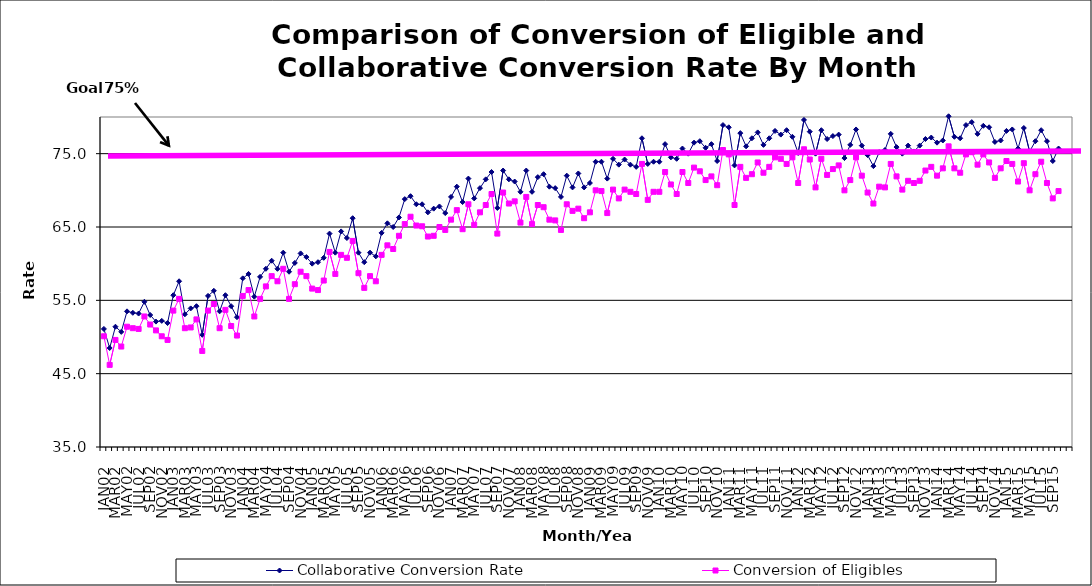
| Category | Collaborative Conversion Rate | Conversion of Eligibles |
|---|---|---|
| JAN02 | 51.1 | 50.1 |
| FEB02 | 48.5 | 46.2 |
| MAR02 | 51.4 | 49.6 |
| APR02 | 50.7 | 48.7 |
| MAY02 | 53.5 | 51.4 |
| JUN02 | 53.3 | 51.2 |
| JUL02 | 53.2 | 51.1 |
| AUG02 | 54.8 | 52.8 |
| SEP02 | 53 | 51.7 |
| OCT02 | 52.1 | 50.9 |
| NOV02 | 52.2 | 50.1 |
| DEC02 | 51.9 | 49.6 |
| JAN03 | 55.7 | 53.6 |
| FEB03 | 57.6 | 55.2 |
| MAR03 | 53.1 | 51.2 |
| APR03 | 53.9 | 51.3 |
| MAY03 | 54.2 | 52.4 |
| JUN03 | 50.3 | 48.1 |
| JUL03 | 55.6 | 53.6 |
| AUG03 | 56.3 | 54.5 |
| SEP03 | 53.5 | 51.2 |
| OCT03 | 55.7 | 53.7 |
| NOV03 | 54.2 | 51.5 |
| DEC03 | 52.7 | 50.2 |
| JAN04 | 58 | 55.6 |
| FEB04 | 58.6 | 56.4 |
| MAR04 | 55.5 | 52.8 |
| APR04 | 58.2 | 55.2 |
| MAY04 | 59.3 | 56.9 |
| JUN04 | 60.4 | 58.3 |
| JUL04 | 59.3 | 57.6 |
| AUG04 | 61.5 | 59.3 |
| SEP04 | 58.9 | 55.2 |
| OCT04 | 60.1 | 57.2 |
| NOV04 | 61.4 | 58.9 |
| DEC04 | 60.9 | 58.3 |
| JAN05 | 60 | 56.6 |
| FEB05 | 60.2 | 56.4 |
| MAR05 | 60.8 | 57.7 |
| APR05 | 64.1 | 61.6 |
| MAY05 | 61.5 | 58.6 |
| JUN05 | 64.4 | 61.2 |
| JUL05 | 63.5 | 60.8 |
| AUG05 | 66.2 | 63.1 |
| SEP05 | 61.5 | 58.7 |
| OCT05 | 60.2 | 56.7 |
| NOV05 | 61.5 | 58.3 |
| DEC05 | 61 | 57.6 |
| JAN06 | 64.2 | 61.2 |
| FEB06 | 65.5 | 62.5 |
| MAR06 | 65 | 62 |
| APR06 | 66.3 | 63.8 |
| MAY06 | 68.8 | 65.4 |
| JUN06 | 69.2 | 66.4 |
| JUL06 | 68.1 | 65.2 |
| AUG06 | 68.1 | 65.1 |
| SEP06 | 67 | 63.7 |
| OCT06 | 67.5 | 63.8 |
| NOV06 | 67.8 | 65 |
| DEC06 | 66.9 | 64.6 |
| JAN07 | 69.1 | 66 |
| FEB07 | 70.5 | 67.3 |
| MAR07 | 68.4 | 64.7 |
| APR07 | 71.6 | 68.1 |
| MAY07 | 68.9 | 65.3 |
| JUN07 | 70.3 | 67 |
| JUL07 | 71.5 | 68 |
| AUG07 | 72.5 | 69.5 |
| SEP07 | 67.6 | 64.1 |
| OCT07 | 72.7 | 69.7 |
| NOV07 | 71.5 | 68.2 |
| DEC07 | 71.2 | 68.5 |
| JAN08 | 69.8 | 65.6 |
| FEB08 | 72.7 | 69.1 |
| MAR08 | 69.8 | 65.4 |
| APR08 | 71.8 | 68 |
| MAY08 | 72.2 | 67.7 |
| JUN08 | 70.5 | 66 |
| JUL08 | 70.3 | 65.9 |
| AUG08 | 69.1 | 64.6 |
| SEP08 | 72 | 68.1 |
| OCT08 | 70.4 | 67.2 |
| NOV08 | 72.3 | 67.5 |
| DEC08 | 70.4 | 66.2 |
| JAN09 | 71 | 67 |
| FEB09 | 73.9 | 70 |
| MAR09 | 73.9 | 69.9 |
| APR09 | 71.6 | 66.9 |
| MAY09 | 74.3 | 70.1 |
| JUN09 | 73.5 | 68.9 |
| JUL09 | 74.2 | 70.1 |
| AUG09 | 73.5 | 69.8 |
| SEP09 | 73.2 | 69.5 |
| OCT09 | 77.1 | 73.6 |
| NOV09 | 73.6 | 68.7 |
| DEC09 | 73.9 | 69.8 |
| JAN10 | 73.9 | 69.8 |
| FEB10 | 76.3 | 72.5 |
| MAR10 | 74.5 | 70.8 |
| APR10 | 74.3 | 69.5 |
| MAY10 | 75.7 | 72.5 |
| JUN10 | 75 | 71 |
| JUL10 | 76.5 | 73.1 |
| AUG10 | 76.7 | 72.6 |
| SEP10 | 75.8 | 71.4 |
| OCT10 | 76.3 | 71.9 |
| NOV10 | 74 | 70.7 |
| DEC10 | 78.9 | 75.5 |
| JAN11 | 78.6 | 74.9 |
| FEB11 | 73.4 | 68 |
| MAR11 | 77.8 | 73.2 |
| APR11 | 76 | 71.7 |
| MAY11 | 77.1 | 72.2 |
| JUN11 | 77.9 | 73.8 |
| JUL11 | 76.2 | 72.4 |
| AUG11 | 77.1 | 73.2 |
| SEP11 | 78.1 | 74.5 |
| OCT11 | 77.6 | 74.3 |
| NOV11 | 78.2 | 73.6 |
| DEC11 | 77.3 | 74.5 |
| JAN12 | 75.1 | 71 |
| FEB12 | 79.6 | 75.6 |
| MAR12 | 78 | 74.2 |
| APR12 | 75 | 70.4 |
| MAY12 | 78.2 | 74.3 |
| JUN12 | 77 | 72.1 |
| JUL12 | 77.4 | 72.9 |
| AUG12 | 77.6 | 73.4 |
| SEP12 | 74.4 | 70 |
| OCT12 | 76.2 | 71.4 |
| NOV12 | 78.3 | 74.5 |
| DEC12 | 76.1 | 72 |
| JAN13 | 74.8 | 69.7 |
| FEB13 | 73.3 | 68.2 |
| MAR13 | 75.2 | 70.5 |
| APR13 | 75.5 | 70.4 |
| MAY13 | 77.7 | 73.6 |
| JUN13 | 75.9 | 71.9 |
| JUL13 | 75 | 70.1 |
| AUG13 | 76.1 | 71.3 |
| SEP13 | 75.3 | 71 |
| OCT13 | 76.1 | 71.3 |
| NOV13 | 77 | 72.7 |
| DEC13 | 77.2 | 73.2 |
| JAN14 | 76.5 | 72 |
| FEB14 | 76.8 | 73 |
| MAR14 | 80.1 | 76 |
| APR14 | 77.3 | 73 |
| MAY14 | 77.1 | 72.4 |
| JUN14 | 78.9 | 74.9 |
| JUL14 | 79.3 | 75.2 |
| AUG14 | 77.7 | 73.5 |
| SEP14 | 78.8 | 74.9 |
| OCT14 | 78.6 | 73.8 |
| NOV14 | 76.6 | 71.7 |
| DEC14 | 76.8 | 73 |
| JAN15 | 78.1 | 74 |
| FEB15 | 78.3 | 73.6 |
| MAR15 | 75.7 | 71.2 |
| APR15 | 78.5 | 73.7 |
| MAY15 | 75.3 | 70 |
| JUN15 | 76.7 | 72.2 |
| JUL15 | 78.2 | 73.9 |
| AUG15 | 76.7 | 71 |
| SEP15 | 74 | 68.9 |
| OCT15 | 75.7 | 69.9 |